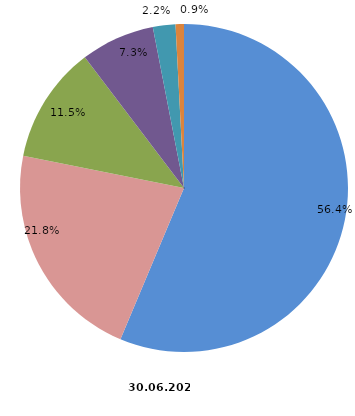
| Category | Anzahl Betriebe 2022 |
|---|---|
| 1 - 4 Beschäftigte | 1570 |
| 5 - 9 Beschäftigte | 608 |
| 10 - 19 Beschäftigte | 321 |
| 20 - 49 Beschäftigte | 203 |
| 50 - 99 Beschäftigte | 62 |
| 100 und mehr Beschäftigte | 23 |